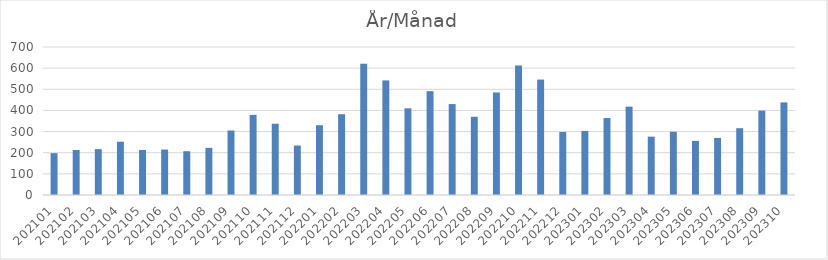
| Category | Summa |
|---|---|
| 202101 | 198 |
| 202102 | 213 |
| 202103 | 217 |
| 202104 | 252 |
| 202105 | 213 |
| 202106 | 215 |
| 202107 | 207 |
| 202108 | 223 |
| 202109 | 305 |
| 202110 | 379 |
| 202111 | 337 |
| 202112 | 234 |
| 202201 | 330 |
| 202202 | 382 |
| 202203 | 621 |
| 202204 | 542 |
| 202205 | 410 |
| 202206 | 491 |
| 202207 | 430 |
| 202208 | 370 |
| 202209 | 485 |
| 202210 | 612 |
| 202211 | 546 |
| 202212 | 298 |
| 202301 | 303 |
| 202302 | 364 |
| 202303 | 418 |
| 202304 | 276 |
| 202305 | 299 |
| 202306 | 256 |
| 202307 | 270 |
| 202308 | 316 |
| 202309 | 399 |
| 202310 | 438 |